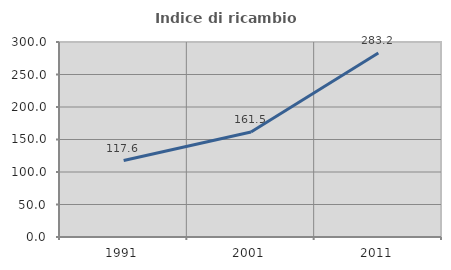
| Category | Indice di ricambio occupazionale  |
|---|---|
| 1991.0 | 117.604 |
| 2001.0 | 161.518 |
| 2011.0 | 283.175 |